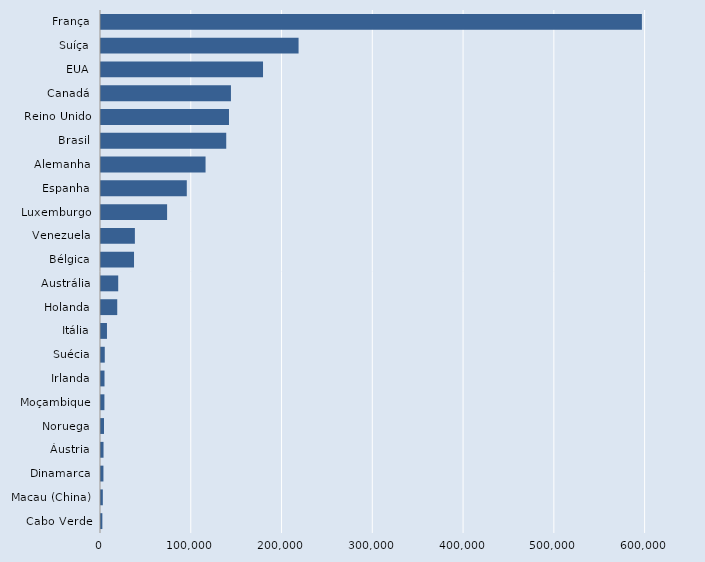
| Category | Series 0 |
|---|---|
| Cabo Verde | 1491 |
| Macau (China) | 2011 |
| Dinamarca | 2682 |
| Áustria | 2782 |
| Noruega | 3328 |
| Moçambique | 3767 |
| Irlanda | 3866 |
| Suécia | 4148 |
| Itália | 6577 |
| Holanda | 17893 |
| Austrália | 18970 |
| Bélgica | 36378 |
| Venezuela | 37326 |
| Luxemburgo | 72821 |
| Espanha | 94520 |
| Alemanha | 115190 |
| Brasil | 137973 |
| Reino Unido | 141000 |
| Canadá | 143160 |
| EUA | 178500 |
| Suíça | 217662 |
| França | 595900 |